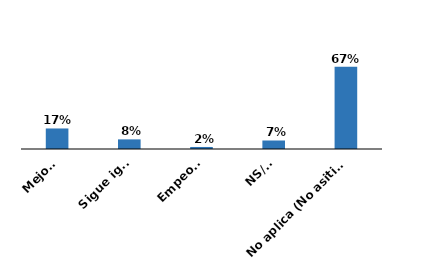
| Category | Series 0 |
|---|---|
| Mejoró | 0.167 |
| Sigue igual | 0.078 |
| Empeoró | 0.017 |
| NS/NR | 0.069 |
| No aplica (No asitió anteriormente) | 0.669 |